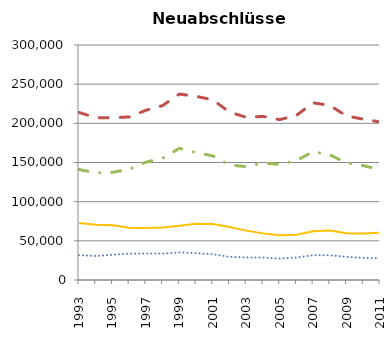
| Category | Produktionsberufe | Dienstleistungsberufe | primäre Dienstleistungs-berufe | sekundäre Dienstleistungsberufe |
|---|---|---|---|---|
| 1993.0 | 31677 | 213897 | 141105 | 72792 |
| 1994.0 | 30660 | 207270 | 136701 | 70569 |
| 1995.0 | 32193 | 207198 | 137424 | 69774 |
| 1996.0 | 33555 | 208137 | 141303 | 66834 |
| 1997.0 | 33918 | 216624 | 150378 | 66246 |
| 1998.0 | 33645 | 222636 | 155571 | 67065 |
| 1999.0 | 35277 | 237336 | 168075 | 69258 |
| 2000.0 | 34329 | 234501 | 162693 | 71808 |
| 2001.0 | 32901 | 230004 | 158478 | 71526 |
| 2002.0 | 29571 | 214413 | 146841 | 67569 |
| 2003.0 | 28767 | 207750 | 144738 | 63012 |
| 2004.0 | 28644 | 208827 | 149316 | 59511 |
| 2005.0 | 27363 | 204768 | 147675 | 57093 |
| 2006.0 | 28716 | 210054 | 152385 | 57669 |
| 2007.0 | 31644 | 226191 | 164001 | 62190 |
| 2008.0 | 31578 | 222885 | 159720 | 63165 |
| 2009.0 | 29556 | 209379 | 149550 | 59829 |
| 2010.0 | 28212 | 205338 | 145881 | 59457 |
| 2011.0 | 27795 | 201693 | 141159 | 60534 |